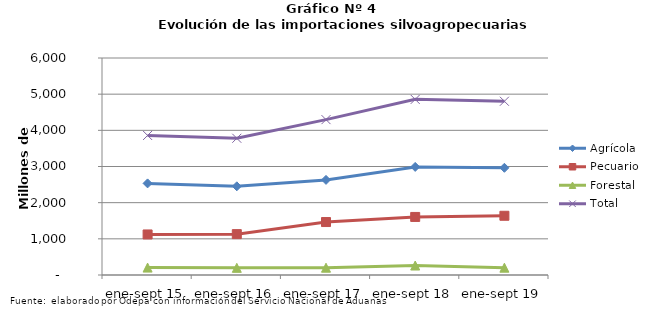
| Category | Agrícola | Pecuario | Forestal | Total |
|---|---|---|---|---|
| ene-sept 15 | 2532664 | 1120991 | 204996 | 3858651 |
| ene-sept 16 | 2452386 | 1129978 | 198194 | 3780558 |
| ene-sept 17 | 2629926 | 1464531 | 201873 | 4296330 |
| ene-sept 18 | 2988653 | 1605214 | 262118 | 4855985 |
| ene-sept 19 | 2964132 | 1637726 | 202107 | 4803965 |